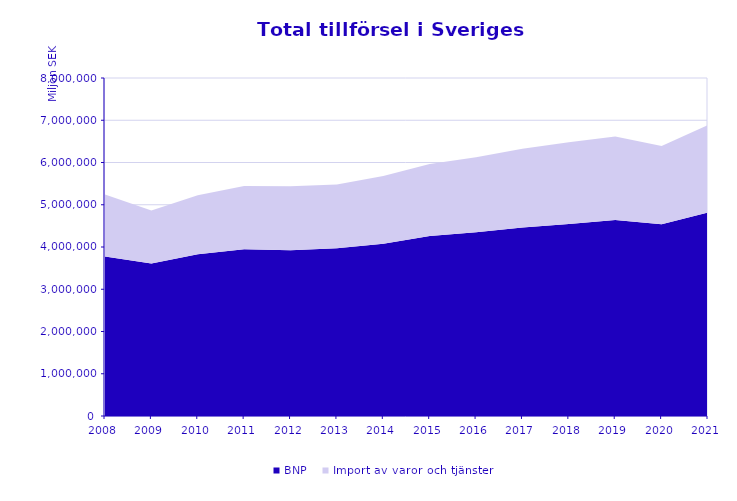
| Category | BNP | Import av varor och tjänster |
|---|---|---|
| 2008.0 | 3775090 | 1466856 |
| 2009.0 | 3611259 | 1253644 |
| 2010.0 | 3826205 | 1397605 |
| 2011.0 | 3948465 | 1496611 |
| 2012.0 | 3925236 | 1511785 |
| 2013.0 | 3971859 | 1508764 |
| 2014.0 | 4077423 | 1605077 |
| 2015.0 | 4260470 | 1702358 |
| 2016.0 | 4348687 | 1778450 |
| 2017.0 | 4460358 | 1862549 |
| 2018.0 | 4547336 | 1933770 |
| 2019.0 | 4637655 | 1974941 |
| 2020.0 | 4537008 | 1855480 |
| 2021.0 | 4815899 | 2070359 |